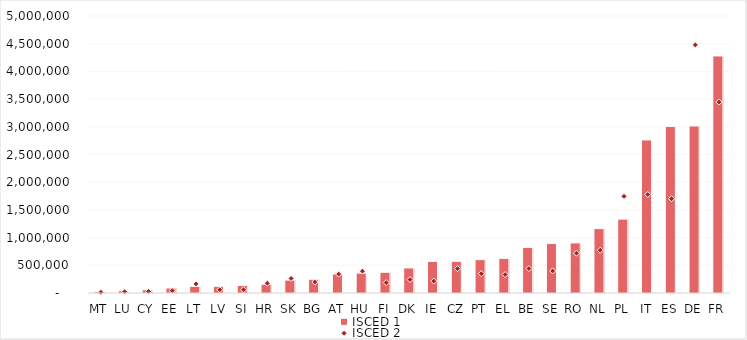
| Category | ISCED 1 |
|---|---|
| MT | 27035 |
| LU | 40098 |
| CY | 59195 |
| EE | 89702 |
| LT | 118616 |
| LV | 120051 |
| SI | 134199 |
| HR | 156627 |
| SK | 232979 |
| BG | 248354 |
| AT | 343981 |
| HU | 358766 |
| FI | 373173 |
| DK | 452253 |
| IE | 570381 |
| CZ | 571922 |
| PT | 601972 |
| EL | 625523 |
| BE | 823725 |
| SE | 892231 |
| RO | 904077 |
| NL | 1161942 |
| PL | 1333675 |
| IT | 2762544 |
| ES | 3006992 |
| DE | 3014502 |
| FR | 4279257 |